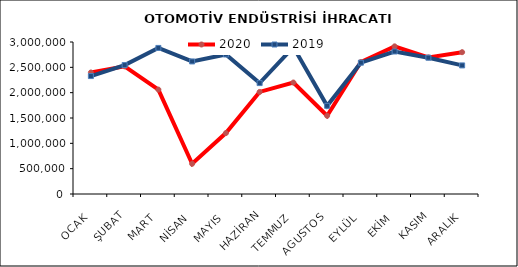
| Category | 2020 | 2019 |
|---|---|---|
| OCAK | 2398190.426 | 2327530.684 |
| ŞUBAT | 2518829.531 | 2544569.748 |
| MART | 2060601.461 | 2883061.003 |
| NİSAN | 596330.702 | 2616414.362 |
| MAYIS | 1202352.117 | 2753037.238 |
| HAZİRAN | 2014227.183 | 2189206.003 |
| TEMMUZ | 2200026.126 | 2900129.458 |
| AGUSTOS | 1543642.778 | 1740661.885 |
| EYLÜL | 2604416.138 | 2591967.215 |
| EKİM | 2914362.92 | 2812518.322 |
| KASIM | 2696558.83 | 2690128.507 |
| ARALIK | 2799027.99 | 2537839.088 |